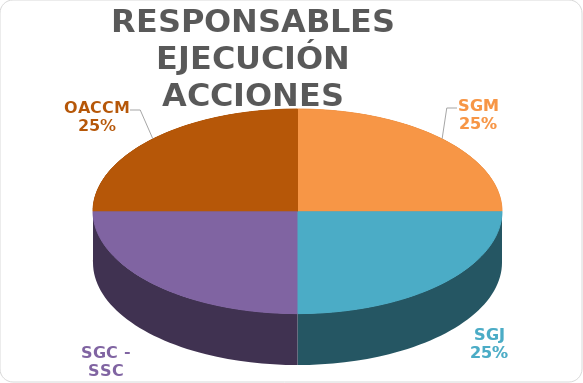
| Category | Series 0 |
|---|---|
| SGM | 1 |
| SGJ | 1 |
| SGC - SSC | 1 |
| OACCM | 1 |